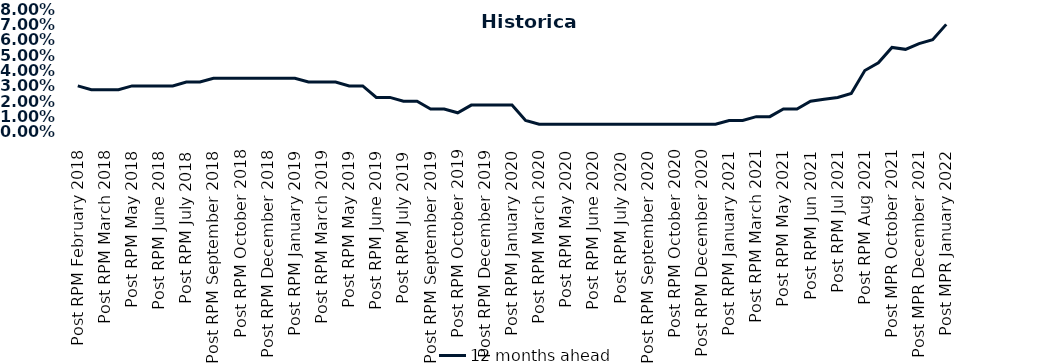
| Category | 12 months ahead |
|---|---|
| Post RPM February 2018 | 0.03 |
| Pre RPM March 2018 | 0.028 |
| Post RPM March 2018 | 0.028 |
| Pre RPM May 2018 | 0.028 |
| Post RPM May 2018 | 0.03 |
| Pre RPM June 2018 | 0.03 |
| Post RPM June 2018 | 0.03 |
| Pre RPM July 2018 | 0.03 |
| Post RPM July 2018 | 0.032 |
| Pre RPM September 2018 | 0.032 |
| Post RPM September 2018 | 0.035 |
| Pre RPM October 2018 | 0.035 |
| Post RPM October 2018 | 0.035 |
| Pre RPM December 2018 | 0.035 |
| Post RPM December 2018 | 0.035 |
| Pre RPM January 2019 | 0.035 |
| Post RPM January 2019 | 0.035 |
| Pre RPM March 2019 | 0.032 |
| Post RPM March 2019 | 0.032 |
| Pre RPM May 2019 | 0.032 |
| Post RPM May 2019 | 0.03 |
| Pre RPM June 2019 | 0.03 |
| Post RPM June 2019 | 0.022 |
| Pre RPM July 2019 | 0.022 |
| Post RPM July 2019 | 0.02 |
| Pre RPM September 2019 | 0.02 |
| Post RPM September 2019 | 0.015 |
| Pre RPM October 2019 | 0.015 |
| Post RPM October 2019 | 0.012 |
| Pre RPM December 2019 | 0.018 |
| Post RPM December 2019 | 0.018 |
| Pre RPM January 2020 | 0.018 |
| Post RPM January 2020 | 0.018 |
| Pre RPM March 2020 | 0.008 |
| Post RPM March 2020 | 0.005 |
| Pre RPM May 2020 | 0.005 |
| Post RPM May 2020 | 0.005 |
| Pre RPM June 2020 | 0.005 |
| Post RPM June 2020 | 0.005 |
| Pre RPM July 2020 | 0.005 |
| Post RPM July 2020 | 0.005 |
| Pre RPM September 2020 | 0.005 |
| Post RPM September 2020 | 0.005 |
| Pre RPM October 2020 | 0.005 |
| Post RPM October 2020 | 0.005 |
| Pre RPM December 2020 | 0.005 |
|  Post RPM December 2020 | 0.005 |
| Pre RPM January 2021 | 0.005 |
| Post RPM January 2021 | 0.008 |
|  Pre RPM March 2021 | 0.008 |
|  Post RPM March 2021 | 0.01 |
|  Pre RPM May 2021 | 0.01 |
|  Post RPM May 2021 | 0.015 |
|  Pre RPM Jun 2021 | 0.015 |
|   Post RPM Jun 2021 | 0.02 |
| Pre RPM Jul 2021 | 0.021 |
|  Post RPM Jul 2021 | 0.022 |
| Pre RPM Aug 2021 | 0.025 |
|  Post RPM Aug 2021 | 0.04 |
| Pre MPR October 2021 | 0.045 |
| Post MPR October 2021 | 0.055 |
| Pre MPR December 2021 | 0.054 |
| Post MPR December 2021 | 0.058 |
| Pre MPR January 2022 | 0.06 |
| Post MPR January 2022 | 0.07 |